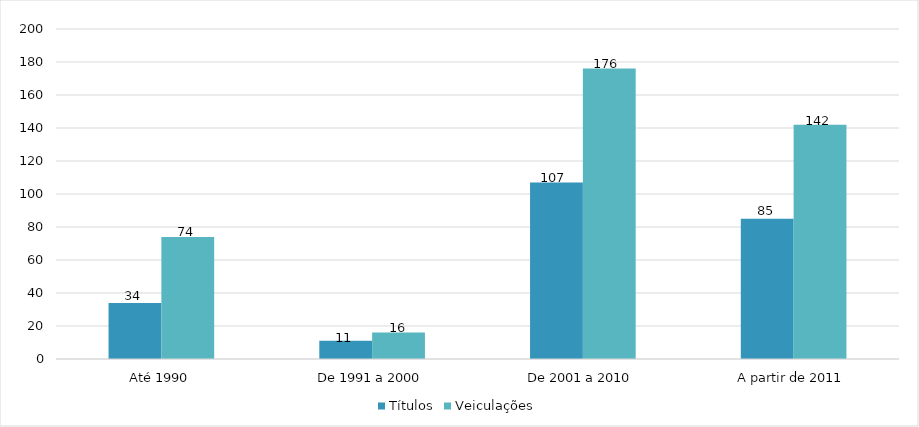
| Category | Títulos | Veiculações |
|---|---|---|
| Até 1990 | 34 | 74 |
| De 1991 a 2000 | 11 | 16 |
| De 2001 a 2010 | 107 | 176 |
| A partir de 2011 | 85 | 142 |